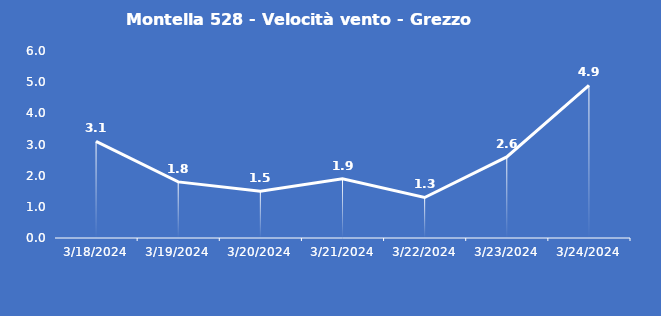
| Category | Montella 528 - Velocità vento - Grezzo (m/s) |
|---|---|
| 3/18/24 | 3.1 |
| 3/19/24 | 1.8 |
| 3/20/24 | 1.5 |
| 3/21/24 | 1.9 |
| 3/22/24 | 1.3 |
| 3/23/24 | 2.6 |
| 3/24/24 | 4.9 |